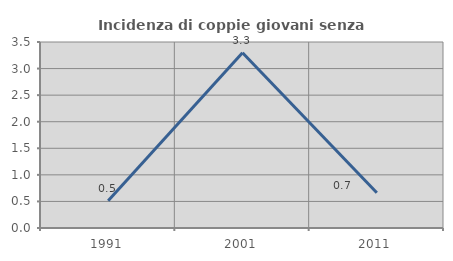
| Category | Incidenza di coppie giovani senza figli |
|---|---|
| 1991.0 | 0.513 |
| 2001.0 | 3.297 |
| 2011.0 | 0.662 |